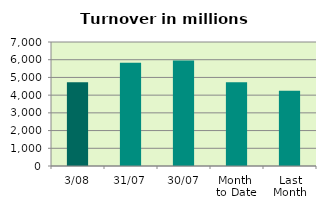
| Category | Series 0 |
|---|---|
| 3/08 | 4726.164 |
| 31/07 | 5824.284 |
| 30/07 | 5953.172 |
| Month 
to Date | 4726.164 |
| Last
Month | 4246.231 |